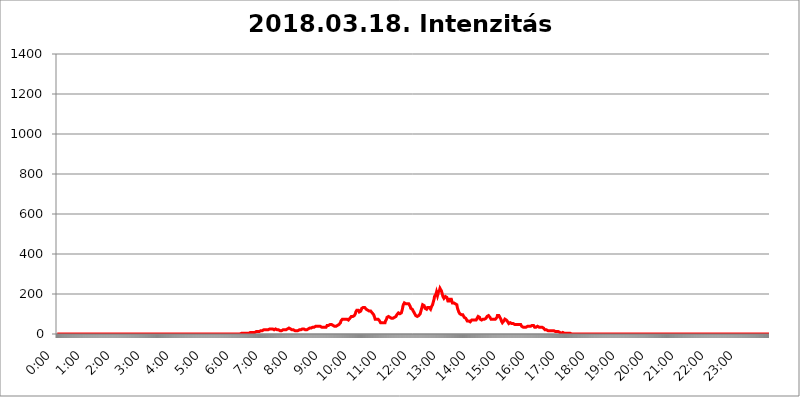
| Category | 2018.03.18. Intenzitás [W/m^2] |
|---|---|
| 0.0 | 0 |
| 0.0006944444444444445 | 0 |
| 0.001388888888888889 | 0 |
| 0.0020833333333333333 | 0 |
| 0.002777777777777778 | 0 |
| 0.003472222222222222 | 0 |
| 0.004166666666666667 | 0 |
| 0.004861111111111111 | 0 |
| 0.005555555555555556 | 0 |
| 0.0062499999999999995 | 0 |
| 0.006944444444444444 | 0 |
| 0.007638888888888889 | 0 |
| 0.008333333333333333 | 0 |
| 0.009027777777777779 | 0 |
| 0.009722222222222222 | 0 |
| 0.010416666666666666 | 0 |
| 0.011111111111111112 | 0 |
| 0.011805555555555555 | 0 |
| 0.012499999999999999 | 0 |
| 0.013194444444444444 | 0 |
| 0.013888888888888888 | 0 |
| 0.014583333333333332 | 0 |
| 0.015277777777777777 | 0 |
| 0.015972222222222224 | 0 |
| 0.016666666666666666 | 0 |
| 0.017361111111111112 | 0 |
| 0.018055555555555557 | 0 |
| 0.01875 | 0 |
| 0.019444444444444445 | 0 |
| 0.02013888888888889 | 0 |
| 0.020833333333333332 | 0 |
| 0.02152777777777778 | 0 |
| 0.022222222222222223 | 0 |
| 0.02291666666666667 | 0 |
| 0.02361111111111111 | 0 |
| 0.024305555555555556 | 0 |
| 0.024999999999999998 | 0 |
| 0.025694444444444447 | 0 |
| 0.02638888888888889 | 0 |
| 0.027083333333333334 | 0 |
| 0.027777777777777776 | 0 |
| 0.02847222222222222 | 0 |
| 0.029166666666666664 | 0 |
| 0.029861111111111113 | 0 |
| 0.030555555555555555 | 0 |
| 0.03125 | 0 |
| 0.03194444444444445 | 0 |
| 0.03263888888888889 | 0 |
| 0.03333333333333333 | 0 |
| 0.034027777777777775 | 0 |
| 0.034722222222222224 | 0 |
| 0.035416666666666666 | 0 |
| 0.036111111111111115 | 0 |
| 0.03680555555555556 | 0 |
| 0.0375 | 0 |
| 0.03819444444444444 | 0 |
| 0.03888888888888889 | 0 |
| 0.03958333333333333 | 0 |
| 0.04027777777777778 | 0 |
| 0.04097222222222222 | 0 |
| 0.041666666666666664 | 0 |
| 0.042361111111111106 | 0 |
| 0.04305555555555556 | 0 |
| 0.043750000000000004 | 0 |
| 0.044444444444444446 | 0 |
| 0.04513888888888889 | 0 |
| 0.04583333333333334 | 0 |
| 0.04652777777777778 | 0 |
| 0.04722222222222222 | 0 |
| 0.04791666666666666 | 0 |
| 0.04861111111111111 | 0 |
| 0.049305555555555554 | 0 |
| 0.049999999999999996 | 0 |
| 0.05069444444444445 | 0 |
| 0.051388888888888894 | 0 |
| 0.052083333333333336 | 0 |
| 0.05277777777777778 | 0 |
| 0.05347222222222222 | 0 |
| 0.05416666666666667 | 0 |
| 0.05486111111111111 | 0 |
| 0.05555555555555555 | 0 |
| 0.05625 | 0 |
| 0.05694444444444444 | 0 |
| 0.057638888888888885 | 0 |
| 0.05833333333333333 | 0 |
| 0.05902777777777778 | 0 |
| 0.059722222222222225 | 0 |
| 0.06041666666666667 | 0 |
| 0.061111111111111116 | 0 |
| 0.06180555555555556 | 0 |
| 0.0625 | 0 |
| 0.06319444444444444 | 0 |
| 0.06388888888888888 | 0 |
| 0.06458333333333334 | 0 |
| 0.06527777777777778 | 0 |
| 0.06597222222222222 | 0 |
| 0.06666666666666667 | 0 |
| 0.06736111111111111 | 0 |
| 0.06805555555555555 | 0 |
| 0.06874999999999999 | 0 |
| 0.06944444444444443 | 0 |
| 0.07013888888888889 | 0 |
| 0.07083333333333333 | 0 |
| 0.07152777777777779 | 0 |
| 0.07222222222222223 | 0 |
| 0.07291666666666667 | 0 |
| 0.07361111111111111 | 0 |
| 0.07430555555555556 | 0 |
| 0.075 | 0 |
| 0.07569444444444444 | 0 |
| 0.0763888888888889 | 0 |
| 0.07708333333333334 | 0 |
| 0.07777777777777778 | 0 |
| 0.07847222222222222 | 0 |
| 0.07916666666666666 | 0 |
| 0.0798611111111111 | 0 |
| 0.08055555555555556 | 0 |
| 0.08125 | 0 |
| 0.08194444444444444 | 0 |
| 0.08263888888888889 | 0 |
| 0.08333333333333333 | 0 |
| 0.08402777777777777 | 0 |
| 0.08472222222222221 | 0 |
| 0.08541666666666665 | 0 |
| 0.08611111111111112 | 0 |
| 0.08680555555555557 | 0 |
| 0.08750000000000001 | 0 |
| 0.08819444444444445 | 0 |
| 0.08888888888888889 | 0 |
| 0.08958333333333333 | 0 |
| 0.09027777777777778 | 0 |
| 0.09097222222222222 | 0 |
| 0.09166666666666667 | 0 |
| 0.09236111111111112 | 0 |
| 0.09305555555555556 | 0 |
| 0.09375 | 0 |
| 0.09444444444444444 | 0 |
| 0.09513888888888888 | 0 |
| 0.09583333333333333 | 0 |
| 0.09652777777777777 | 0 |
| 0.09722222222222222 | 0 |
| 0.09791666666666667 | 0 |
| 0.09861111111111111 | 0 |
| 0.09930555555555555 | 0 |
| 0.09999999999999999 | 0 |
| 0.10069444444444443 | 0 |
| 0.1013888888888889 | 0 |
| 0.10208333333333335 | 0 |
| 0.10277777777777779 | 0 |
| 0.10347222222222223 | 0 |
| 0.10416666666666667 | 0 |
| 0.10486111111111111 | 0 |
| 0.10555555555555556 | 0 |
| 0.10625 | 0 |
| 0.10694444444444444 | 0 |
| 0.1076388888888889 | 0 |
| 0.10833333333333334 | 0 |
| 0.10902777777777778 | 0 |
| 0.10972222222222222 | 0 |
| 0.1111111111111111 | 0 |
| 0.11180555555555556 | 0 |
| 0.11180555555555556 | 0 |
| 0.1125 | 0 |
| 0.11319444444444444 | 0 |
| 0.11388888888888889 | 0 |
| 0.11458333333333333 | 0 |
| 0.11527777777777777 | 0 |
| 0.11597222222222221 | 0 |
| 0.11666666666666665 | 0 |
| 0.1173611111111111 | 0 |
| 0.11805555555555557 | 0 |
| 0.11944444444444445 | 0 |
| 0.12013888888888889 | 0 |
| 0.12083333333333333 | 0 |
| 0.12152777777777778 | 0 |
| 0.12222222222222223 | 0 |
| 0.12291666666666667 | 0 |
| 0.12291666666666667 | 0 |
| 0.12361111111111112 | 0 |
| 0.12430555555555556 | 0 |
| 0.125 | 0 |
| 0.12569444444444444 | 0 |
| 0.12638888888888888 | 0 |
| 0.12708333333333333 | 0 |
| 0.16875 | 0 |
| 0.12847222222222224 | 0 |
| 0.12916666666666668 | 0 |
| 0.12986111111111112 | 0 |
| 0.13055555555555556 | 0 |
| 0.13125 | 0 |
| 0.13194444444444445 | 0 |
| 0.1326388888888889 | 0 |
| 0.13333333333333333 | 0 |
| 0.13402777777777777 | 0 |
| 0.13402777777777777 | 0 |
| 0.13472222222222222 | 0 |
| 0.13541666666666666 | 0 |
| 0.1361111111111111 | 0 |
| 0.13749999999999998 | 0 |
| 0.13819444444444443 | 0 |
| 0.1388888888888889 | 0 |
| 0.13958333333333334 | 0 |
| 0.14027777777777778 | 0 |
| 0.14097222222222222 | 0 |
| 0.14166666666666666 | 0 |
| 0.1423611111111111 | 0 |
| 0.14305555555555557 | 0 |
| 0.14375000000000002 | 0 |
| 0.14444444444444446 | 0 |
| 0.1451388888888889 | 0 |
| 0.1451388888888889 | 0 |
| 0.14652777777777778 | 0 |
| 0.14722222222222223 | 0 |
| 0.14791666666666667 | 0 |
| 0.1486111111111111 | 0 |
| 0.14930555555555555 | 0 |
| 0.15 | 0 |
| 0.15069444444444444 | 0 |
| 0.15138888888888888 | 0 |
| 0.15208333333333332 | 0 |
| 0.15277777777777776 | 0 |
| 0.15347222222222223 | 0 |
| 0.15416666666666667 | 0 |
| 0.15486111111111112 | 0 |
| 0.15555555555555556 | 0 |
| 0.15625 | 0 |
| 0.15694444444444444 | 0 |
| 0.15763888888888888 | 0 |
| 0.15833333333333333 | 0 |
| 0.15902777777777777 | 0 |
| 0.15972222222222224 | 0 |
| 0.16041666666666668 | 0 |
| 0.16111111111111112 | 0 |
| 0.16180555555555556 | 0 |
| 0.1625 | 0 |
| 0.16319444444444445 | 0 |
| 0.1638888888888889 | 0 |
| 0.16458333333333333 | 0 |
| 0.16527777777777777 | 0 |
| 0.16597222222222222 | 0 |
| 0.16666666666666666 | 0 |
| 0.1673611111111111 | 0 |
| 0.16805555555555554 | 0 |
| 0.16874999999999998 | 0 |
| 0.16944444444444443 | 0 |
| 0.17013888888888887 | 0 |
| 0.1708333333333333 | 0 |
| 0.17152777777777775 | 0 |
| 0.17222222222222225 | 0 |
| 0.1729166666666667 | 0 |
| 0.17361111111111113 | 0 |
| 0.17430555555555557 | 0 |
| 0.17500000000000002 | 0 |
| 0.17569444444444446 | 0 |
| 0.1763888888888889 | 0 |
| 0.17708333333333334 | 0 |
| 0.17777777777777778 | 0 |
| 0.17847222222222223 | 0 |
| 0.17916666666666667 | 0 |
| 0.1798611111111111 | 0 |
| 0.18055555555555555 | 0 |
| 0.18125 | 0 |
| 0.18194444444444444 | 0 |
| 0.1826388888888889 | 0 |
| 0.18333333333333335 | 0 |
| 0.1840277777777778 | 0 |
| 0.18472222222222223 | 0 |
| 0.18541666666666667 | 0 |
| 0.18611111111111112 | 0 |
| 0.18680555555555556 | 0 |
| 0.1875 | 0 |
| 0.18819444444444444 | 0 |
| 0.18888888888888888 | 0 |
| 0.18958333333333333 | 0 |
| 0.19027777777777777 | 0 |
| 0.1909722222222222 | 0 |
| 0.19166666666666665 | 0 |
| 0.19236111111111112 | 0 |
| 0.19305555555555554 | 0 |
| 0.19375 | 0 |
| 0.19444444444444445 | 0 |
| 0.1951388888888889 | 0 |
| 0.19583333333333333 | 0 |
| 0.19652777777777777 | 0 |
| 0.19722222222222222 | 0 |
| 0.19791666666666666 | 0 |
| 0.1986111111111111 | 0 |
| 0.19930555555555554 | 0 |
| 0.19999999999999998 | 0 |
| 0.20069444444444443 | 0 |
| 0.20138888888888887 | 0 |
| 0.2020833333333333 | 0 |
| 0.2027777777777778 | 0 |
| 0.2034722222222222 | 0 |
| 0.2041666666666667 | 0 |
| 0.20486111111111113 | 0 |
| 0.20555555555555557 | 0 |
| 0.20625000000000002 | 0 |
| 0.20694444444444446 | 0 |
| 0.2076388888888889 | 0 |
| 0.20833333333333334 | 0 |
| 0.20902777777777778 | 0 |
| 0.20972222222222223 | 0 |
| 0.21041666666666667 | 0 |
| 0.2111111111111111 | 0 |
| 0.21180555555555555 | 0 |
| 0.2125 | 0 |
| 0.21319444444444444 | 0 |
| 0.2138888888888889 | 0 |
| 0.21458333333333335 | 0 |
| 0.2152777777777778 | 0 |
| 0.21597222222222223 | 0 |
| 0.21666666666666667 | 0 |
| 0.21736111111111112 | 0 |
| 0.21805555555555556 | 0 |
| 0.21875 | 0 |
| 0.21944444444444444 | 0 |
| 0.22013888888888888 | 0 |
| 0.22083333333333333 | 0 |
| 0.22152777777777777 | 0 |
| 0.2222222222222222 | 0 |
| 0.22291666666666665 | 0 |
| 0.2236111111111111 | 0 |
| 0.22430555555555556 | 0 |
| 0.225 | 0 |
| 0.22569444444444445 | 0 |
| 0.2263888888888889 | 0 |
| 0.22708333333333333 | 0 |
| 0.22777777777777777 | 0 |
| 0.22847222222222222 | 0 |
| 0.22916666666666666 | 0 |
| 0.2298611111111111 | 0 |
| 0.23055555555555554 | 0 |
| 0.23124999999999998 | 0 |
| 0.23194444444444443 | 0 |
| 0.23263888888888887 | 0 |
| 0.2333333333333333 | 0 |
| 0.2340277777777778 | 0 |
| 0.2347222222222222 | 0 |
| 0.2354166666666667 | 0 |
| 0.23611111111111113 | 0 |
| 0.23680555555555557 | 0 |
| 0.23750000000000002 | 0 |
| 0.23819444444444446 | 0 |
| 0.2388888888888889 | 0 |
| 0.23958333333333334 | 0 |
| 0.24027777777777778 | 0 |
| 0.24097222222222223 | 0 |
| 0.24166666666666667 | 0 |
| 0.2423611111111111 | 0 |
| 0.24305555555555555 | 0 |
| 0.24375 | 0 |
| 0.24444444444444446 | 0 |
| 0.24513888888888888 | 0 |
| 0.24583333333333335 | 0 |
| 0.2465277777777778 | 0 |
| 0.24722222222222223 | 0 |
| 0.24791666666666667 | 0 |
| 0.24861111111111112 | 0 |
| 0.24930555555555556 | 0 |
| 0.25 | 0 |
| 0.25069444444444444 | 0 |
| 0.2513888888888889 | 0 |
| 0.2520833333333333 | 0 |
| 0.25277777777777777 | 0 |
| 0.2534722222222222 | 0 |
| 0.25416666666666665 | 0 |
| 0.2548611111111111 | 0 |
| 0.2555555555555556 | 0 |
| 0.25625000000000003 | 0 |
| 0.2569444444444445 | 0 |
| 0.2576388888888889 | 0 |
| 0.25833333333333336 | 3.525 |
| 0.2590277777777778 | 3.525 |
| 0.25972222222222224 | 3.525 |
| 0.2604166666666667 | 3.525 |
| 0.2611111111111111 | 3.525 |
| 0.26180555555555557 | 3.525 |
| 0.2625 | 3.525 |
| 0.26319444444444445 | 3.525 |
| 0.2638888888888889 | 3.525 |
| 0.26458333333333334 | 3.525 |
| 0.2652777777777778 | 3.525 |
| 0.2659722222222222 | 3.525 |
| 0.26666666666666666 | 3.525 |
| 0.2673611111111111 | 3.525 |
| 0.26805555555555555 | 3.525 |
| 0.26875 | 3.525 |
| 0.26944444444444443 | 3.525 |
| 0.2701388888888889 | 7.887 |
| 0.2708333333333333 | 7.887 |
| 0.27152777777777776 | 7.887 |
| 0.2722222222222222 | 7.887 |
| 0.27291666666666664 | 7.887 |
| 0.2736111111111111 | 7.887 |
| 0.2743055555555555 | 7.887 |
| 0.27499999999999997 | 7.887 |
| 0.27569444444444446 | 7.887 |
| 0.27638888888888885 | 7.887 |
| 0.27708333333333335 | 7.887 |
| 0.2777777777777778 | 7.887 |
| 0.27847222222222223 | 12.257 |
| 0.2791666666666667 | 12.257 |
| 0.2798611111111111 | 12.257 |
| 0.28055555555555556 | 12.257 |
| 0.28125 | 12.257 |
| 0.28194444444444444 | 12.257 |
| 0.2826388888888889 | 12.257 |
| 0.2833333333333333 | 12.257 |
| 0.28402777777777777 | 12.257 |
| 0.2847222222222222 | 12.257 |
| 0.28541666666666665 | 16.636 |
| 0.28611111111111115 | 16.636 |
| 0.28680555555555554 | 16.636 |
| 0.28750000000000003 | 16.636 |
| 0.2881944444444445 | 16.636 |
| 0.2888888888888889 | 21.024 |
| 0.28958333333333336 | 21.024 |
| 0.2902777777777778 | 16.636 |
| 0.29097222222222224 | 16.636 |
| 0.2916666666666667 | 21.024 |
| 0.2923611111111111 | 21.024 |
| 0.29305555555555557 | 21.024 |
| 0.29375 | 21.024 |
| 0.29444444444444445 | 21.024 |
| 0.2951388888888889 | 21.024 |
| 0.29583333333333334 | 21.024 |
| 0.2965277777777778 | 25.419 |
| 0.2972222222222222 | 25.419 |
| 0.29791666666666666 | 25.419 |
| 0.2986111111111111 | 25.419 |
| 0.29930555555555555 | 25.419 |
| 0.3 | 25.419 |
| 0.30069444444444443 | 21.024 |
| 0.3013888888888889 | 21.024 |
| 0.3020833333333333 | 25.419 |
| 0.30277777777777776 | 21.024 |
| 0.3034722222222222 | 21.024 |
| 0.30416666666666664 | 21.024 |
| 0.3048611111111111 | 21.024 |
| 0.3055555555555555 | 25.419 |
| 0.30624999999999997 | 25.419 |
| 0.3069444444444444 | 25.419 |
| 0.3076388888888889 | 21.024 |
| 0.30833333333333335 | 21.024 |
| 0.3090277777777778 | 21.024 |
| 0.30972222222222223 | 21.024 |
| 0.3104166666666667 | 21.024 |
| 0.3111111111111111 | 21.024 |
| 0.31180555555555556 | 16.636 |
| 0.3125 | 16.636 |
| 0.31319444444444444 | 16.636 |
| 0.3138888888888889 | 16.636 |
| 0.3145833333333333 | 16.636 |
| 0.31527777777777777 | 16.636 |
| 0.3159722222222222 | 21.024 |
| 0.31666666666666665 | 21.024 |
| 0.31736111111111115 | 21.024 |
| 0.31805555555555554 | 21.024 |
| 0.31875000000000003 | 21.024 |
| 0.3194444444444445 | 21.024 |
| 0.3201388888888889 | 21.024 |
| 0.32083333333333336 | 21.024 |
| 0.3215277777777778 | 21.024 |
| 0.32222222222222224 | 25.419 |
| 0.3229166666666667 | 25.419 |
| 0.3236111111111111 | 29.823 |
| 0.32430555555555557 | 29.823 |
| 0.325 | 29.823 |
| 0.32569444444444445 | 29.823 |
| 0.3263888888888889 | 29.823 |
| 0.32708333333333334 | 25.419 |
| 0.3277777777777778 | 21.024 |
| 0.3284722222222222 | 21.024 |
| 0.32916666666666666 | 21.024 |
| 0.3298611111111111 | 25.419 |
| 0.33055555555555555 | 25.419 |
| 0.33125 | 21.024 |
| 0.33194444444444443 | 21.024 |
| 0.3326388888888889 | 16.636 |
| 0.3333333333333333 | 16.636 |
| 0.3340277777777778 | 21.024 |
| 0.3347222222222222 | 21.024 |
| 0.3354166666666667 | 16.636 |
| 0.3361111111111111 | 16.636 |
| 0.3368055555555556 | 16.636 |
| 0.33749999999999997 | 16.636 |
| 0.33819444444444446 | 21.024 |
| 0.33888888888888885 | 21.024 |
| 0.33958333333333335 | 21.024 |
| 0.34027777777777773 | 21.024 |
| 0.34097222222222223 | 21.024 |
| 0.3416666666666666 | 21.024 |
| 0.3423611111111111 | 25.419 |
| 0.3430555555555555 | 25.419 |
| 0.34375 | 25.419 |
| 0.3444444444444445 | 25.419 |
| 0.3451388888888889 | 25.419 |
| 0.3458333333333334 | 25.419 |
| 0.34652777777777777 | 25.419 |
| 0.34722222222222227 | 21.024 |
| 0.34791666666666665 | 21.024 |
| 0.34861111111111115 | 21.024 |
| 0.34930555555555554 | 21.024 |
| 0.35000000000000003 | 21.024 |
| 0.3506944444444444 | 21.024 |
| 0.3513888888888889 | 25.419 |
| 0.3520833333333333 | 25.419 |
| 0.3527777777777778 | 25.419 |
| 0.3534722222222222 | 25.419 |
| 0.3541666666666667 | 29.823 |
| 0.3548611111111111 | 29.823 |
| 0.35555555555555557 | 29.823 |
| 0.35625 | 29.823 |
| 0.35694444444444445 | 29.823 |
| 0.3576388888888889 | 34.234 |
| 0.35833333333333334 | 34.234 |
| 0.3590277777777778 | 34.234 |
| 0.3597222222222222 | 34.234 |
| 0.36041666666666666 | 34.234 |
| 0.3611111111111111 | 34.234 |
| 0.36180555555555555 | 34.234 |
| 0.3625 | 38.653 |
| 0.36319444444444443 | 38.653 |
| 0.3638888888888889 | 34.234 |
| 0.3645833333333333 | 38.653 |
| 0.3652777777777778 | 38.653 |
| 0.3659722222222222 | 38.653 |
| 0.3666666666666667 | 38.653 |
| 0.3673611111111111 | 38.653 |
| 0.3680555555555556 | 38.653 |
| 0.36874999999999997 | 38.653 |
| 0.36944444444444446 | 34.234 |
| 0.37013888888888885 | 34.234 |
| 0.37083333333333335 | 34.234 |
| 0.37152777777777773 | 34.234 |
| 0.37222222222222223 | 34.234 |
| 0.3729166666666666 | 34.234 |
| 0.3736111111111111 | 38.653 |
| 0.3743055555555555 | 34.234 |
| 0.375 | 34.234 |
| 0.3756944444444445 | 34.234 |
| 0.3763888888888889 | 34.234 |
| 0.3770833333333334 | 34.234 |
| 0.37777777777777777 | 38.653 |
| 0.37847222222222227 | 43.079 |
| 0.37916666666666665 | 43.079 |
| 0.37986111111111115 | 43.079 |
| 0.38055555555555554 | 43.079 |
| 0.38125000000000003 | 43.079 |
| 0.3819444444444444 | 47.511 |
| 0.3826388888888889 | 47.511 |
| 0.3833333333333333 | 47.511 |
| 0.3840277777777778 | 47.511 |
| 0.3847222222222222 | 47.511 |
| 0.3854166666666667 | 43.079 |
| 0.3861111111111111 | 43.079 |
| 0.38680555555555557 | 43.079 |
| 0.3875 | 38.653 |
| 0.38819444444444445 | 38.653 |
| 0.3888888888888889 | 38.653 |
| 0.38958333333333334 | 38.653 |
| 0.3902777777777778 | 38.653 |
| 0.3909722222222222 | 38.653 |
| 0.39166666666666666 | 38.653 |
| 0.3923611111111111 | 43.079 |
| 0.39305555555555555 | 43.079 |
| 0.39375 | 47.511 |
| 0.39444444444444443 | 47.511 |
| 0.3951388888888889 | 47.511 |
| 0.3958333333333333 | 51.951 |
| 0.3965277777777778 | 51.951 |
| 0.3972222222222222 | 56.398 |
| 0.3979166666666667 | 65.31 |
| 0.3986111111111111 | 65.31 |
| 0.3993055555555556 | 69.775 |
| 0.39999999999999997 | 74.246 |
| 0.40069444444444446 | 74.246 |
| 0.40138888888888885 | 74.246 |
| 0.40208333333333335 | 74.246 |
| 0.40277777777777773 | 74.246 |
| 0.40347222222222223 | 74.246 |
| 0.4041666666666666 | 74.246 |
| 0.4048611111111111 | 74.246 |
| 0.4055555555555555 | 74.246 |
| 0.40625 | 74.246 |
| 0.4069444444444445 | 74.246 |
| 0.4076388888888889 | 69.775 |
| 0.4083333333333334 | 69.775 |
| 0.40902777777777777 | 74.246 |
| 0.40972222222222227 | 74.246 |
| 0.41041666666666665 | 78.722 |
| 0.41111111111111115 | 83.205 |
| 0.41180555555555554 | 83.205 |
| 0.41250000000000003 | 87.692 |
| 0.4131944444444444 | 87.692 |
| 0.4138888888888889 | 87.692 |
| 0.4145833333333333 | 87.692 |
| 0.4152777777777778 | 87.692 |
| 0.4159722222222222 | 92.184 |
| 0.4166666666666667 | 92.184 |
| 0.4173611111111111 | 96.682 |
| 0.41805555555555557 | 101.184 |
| 0.41875 | 110.201 |
| 0.41944444444444445 | 114.716 |
| 0.4201388888888889 | 119.235 |
| 0.42083333333333334 | 119.235 |
| 0.4215277777777778 | 119.235 |
| 0.4222222222222222 | 119.235 |
| 0.42291666666666666 | 114.716 |
| 0.4236111111111111 | 110.201 |
| 0.42430555555555555 | 105.69 |
| 0.425 | 110.201 |
| 0.42569444444444443 | 114.716 |
| 0.4263888888888889 | 119.235 |
| 0.4270833333333333 | 128.284 |
| 0.4277777777777778 | 132.814 |
| 0.4284722222222222 | 132.814 |
| 0.4291666666666667 | 132.814 |
| 0.4298611111111111 | 137.347 |
| 0.4305555555555556 | 137.347 |
| 0.43124999999999997 | 132.814 |
| 0.43194444444444446 | 128.284 |
| 0.43263888888888885 | 128.284 |
| 0.43333333333333335 | 123.758 |
| 0.43402777777777773 | 123.758 |
| 0.43472222222222223 | 123.758 |
| 0.4354166666666666 | 119.235 |
| 0.4361111111111111 | 119.235 |
| 0.4368055555555555 | 114.716 |
| 0.4375 | 114.716 |
| 0.4381944444444445 | 110.201 |
| 0.4388888888888889 | 110.201 |
| 0.4395833333333334 | 114.716 |
| 0.44027777777777777 | 114.716 |
| 0.44097222222222227 | 110.201 |
| 0.44166666666666665 | 105.69 |
| 0.44236111111111115 | 105.69 |
| 0.44305555555555554 | 105.69 |
| 0.44375000000000003 | 96.682 |
| 0.4444444444444444 | 92.184 |
| 0.4451388888888889 | 83.205 |
| 0.4458333333333333 | 74.246 |
| 0.4465277777777778 | 78.722 |
| 0.4472222222222222 | 74.246 |
| 0.4479166666666667 | 74.246 |
| 0.4486111111111111 | 74.246 |
| 0.44930555555555557 | 74.246 |
| 0.45 | 74.246 |
| 0.45069444444444445 | 74.246 |
| 0.4513888888888889 | 69.775 |
| 0.45208333333333334 | 65.31 |
| 0.4527777777777778 | 60.85 |
| 0.4534722222222222 | 56.398 |
| 0.45416666666666666 | 56.398 |
| 0.4548611111111111 | 56.398 |
| 0.45555555555555555 | 56.398 |
| 0.45625 | 60.85 |
| 0.45694444444444443 | 60.85 |
| 0.4576388888888889 | 56.398 |
| 0.4583333333333333 | 56.398 |
| 0.4590277777777778 | 56.398 |
| 0.4597222222222222 | 56.398 |
| 0.4604166666666667 | 65.31 |
| 0.4611111111111111 | 69.775 |
| 0.4618055555555556 | 74.246 |
| 0.46249999999999997 | 83.205 |
| 0.46319444444444446 | 87.692 |
| 0.46388888888888885 | 87.692 |
| 0.46458333333333335 | 87.692 |
| 0.46527777777777773 | 92.184 |
| 0.46597222222222223 | 87.692 |
| 0.4666666666666666 | 83.205 |
| 0.4673611111111111 | 78.722 |
| 0.4680555555555555 | 78.722 |
| 0.46875 | 78.722 |
| 0.4694444444444445 | 74.246 |
| 0.4701388888888889 | 78.722 |
| 0.4708333333333334 | 78.722 |
| 0.47152777777777777 | 78.722 |
| 0.47222222222222227 | 83.205 |
| 0.47291666666666665 | 83.205 |
| 0.47361111111111115 | 83.205 |
| 0.47430555555555554 | 87.692 |
| 0.47500000000000003 | 87.692 |
| 0.4756944444444444 | 92.184 |
| 0.4763888888888889 | 96.682 |
| 0.4770833333333333 | 101.184 |
| 0.4777777777777778 | 101.184 |
| 0.4784722222222222 | 105.69 |
| 0.4791666666666667 | 105.69 |
| 0.4798611111111111 | 105.69 |
| 0.48055555555555557 | 101.184 |
| 0.48125 | 101.184 |
| 0.48194444444444445 | 101.184 |
| 0.4826388888888889 | 105.69 |
| 0.48333333333333334 | 114.716 |
| 0.4840277777777778 | 123.758 |
| 0.4847222222222222 | 137.347 |
| 0.48541666666666666 | 146.423 |
| 0.4861111111111111 | 150.964 |
| 0.48680555555555555 | 155.509 |
| 0.4875 | 155.509 |
| 0.48819444444444443 | 150.964 |
| 0.4888888888888889 | 150.964 |
| 0.4895833333333333 | 146.423 |
| 0.4902777777777778 | 150.964 |
| 0.4909722222222222 | 150.964 |
| 0.4916666666666667 | 150.964 |
| 0.4923611111111111 | 155.509 |
| 0.4930555555555556 | 150.964 |
| 0.49374999999999997 | 150.964 |
| 0.49444444444444446 | 146.423 |
| 0.49513888888888885 | 137.347 |
| 0.49583333333333335 | 128.284 |
| 0.49652777777777773 | 123.758 |
| 0.49722222222222223 | 123.758 |
| 0.4979166666666666 | 123.758 |
| 0.4986111111111111 | 123.758 |
| 0.4993055555555555 | 119.235 |
| 0.5 | 110.201 |
| 0.5006944444444444 | 105.69 |
| 0.5013888888888889 | 101.184 |
| 0.5020833333333333 | 96.682 |
| 0.5027777777777778 | 92.184 |
| 0.5034722222222222 | 92.184 |
| 0.5041666666666667 | 87.692 |
| 0.5048611111111111 | 87.692 |
| 0.5055555555555555 | 87.692 |
| 0.50625 | 92.184 |
| 0.5069444444444444 | 92.184 |
| 0.5076388888888889 | 92.184 |
| 0.5083333333333333 | 96.682 |
| 0.5090277777777777 | 101.184 |
| 0.5097222222222222 | 110.201 |
| 0.5104166666666666 | 119.235 |
| 0.5111111111111112 | 128.284 |
| 0.5118055555555555 | 137.347 |
| 0.5125000000000001 | 146.423 |
| 0.5131944444444444 | 150.964 |
| 0.513888888888889 | 146.423 |
| 0.5145833333333333 | 141.884 |
| 0.5152777777777778 | 137.347 |
| 0.5159722222222222 | 128.284 |
| 0.5166666666666667 | 128.284 |
| 0.517361111111111 | 123.758 |
| 0.5180555555555556 | 123.758 |
| 0.5187499999999999 | 128.284 |
| 0.5194444444444445 | 132.814 |
| 0.5201388888888888 | 137.347 |
| 0.5208333333333334 | 137.347 |
| 0.5215277777777778 | 132.814 |
| 0.5222222222222223 | 128.284 |
| 0.5229166666666667 | 128.284 |
| 0.5236111111111111 | 123.758 |
| 0.5243055555555556 | 128.284 |
| 0.525 | 137.347 |
| 0.5256944444444445 | 141.884 |
| 0.5263888888888889 | 146.423 |
| 0.5270833333333333 | 155.509 |
| 0.5277777777777778 | 164.605 |
| 0.5284722222222222 | 173.709 |
| 0.5291666666666667 | 187.378 |
| 0.5298611111111111 | 191.937 |
| 0.5305555555555556 | 191.937 |
| 0.53125 | 201.058 |
| 0.5319444444444444 | 210.182 |
| 0.5326388888888889 | 201.058 |
| 0.5333333333333333 | 191.937 |
| 0.5340277777777778 | 196.497 |
| 0.5347222222222222 | 210.182 |
| 0.5354166666666667 | 214.746 |
| 0.5361111111111111 | 219.309 |
| 0.5368055555555555 | 228.436 |
| 0.5375 | 233 |
| 0.5381944444444444 | 228.436 |
| 0.5388888888888889 | 214.746 |
| 0.5395833333333333 | 210.182 |
| 0.5402777777777777 | 196.497 |
| 0.5409722222222222 | 187.378 |
| 0.5416666666666666 | 182.82 |
| 0.5423611111111112 | 178.264 |
| 0.5430555555555555 | 178.264 |
| 0.5437500000000001 | 182.82 |
| 0.5444444444444444 | 187.378 |
| 0.545138888888889 | 191.937 |
| 0.5458333333333333 | 187.378 |
| 0.5465277777777778 | 182.82 |
| 0.5472222222222222 | 182.82 |
| 0.5479166666666667 | 164.605 |
| 0.548611111111111 | 164.605 |
| 0.5493055555555556 | 164.605 |
| 0.5499999999999999 | 164.605 |
| 0.5506944444444445 | 173.709 |
| 0.5513888888888888 | 173.709 |
| 0.5520833333333334 | 173.709 |
| 0.5527777777777778 | 173.709 |
| 0.5534722222222223 | 164.605 |
| 0.5541666666666667 | 155.509 |
| 0.5548611111111111 | 150.964 |
| 0.5555555555555556 | 155.509 |
| 0.55625 | 155.509 |
| 0.5569444444444445 | 155.509 |
| 0.5576388888888889 | 155.509 |
| 0.5583333333333333 | 150.964 |
| 0.5590277777777778 | 155.509 |
| 0.5597222222222222 | 155.509 |
| 0.5604166666666667 | 146.423 |
| 0.5611111111111111 | 132.814 |
| 0.5618055555555556 | 123.758 |
| 0.5625 | 119.235 |
| 0.5631944444444444 | 110.201 |
| 0.5638888888888889 | 105.69 |
| 0.5645833333333333 | 101.184 |
| 0.5652777777777778 | 101.184 |
| 0.5659722222222222 | 96.682 |
| 0.5666666666666667 | 96.682 |
| 0.5673611111111111 | 101.184 |
| 0.5680555555555555 | 101.184 |
| 0.56875 | 96.682 |
| 0.5694444444444444 | 92.184 |
| 0.5701388888888889 | 92.184 |
| 0.5708333333333333 | 83.205 |
| 0.5715277777777777 | 83.205 |
| 0.5722222222222222 | 83.205 |
| 0.5729166666666666 | 78.722 |
| 0.5736111111111112 | 74.246 |
| 0.5743055555555555 | 74.246 |
| 0.5750000000000001 | 65.31 |
| 0.5756944444444444 | 65.31 |
| 0.576388888888889 | 65.31 |
| 0.5770833333333333 | 65.31 |
| 0.5777777777777778 | 60.85 |
| 0.5784722222222222 | 60.85 |
| 0.5791666666666667 | 60.85 |
| 0.579861111111111 | 65.31 |
| 0.5805555555555556 | 65.31 |
| 0.5812499999999999 | 69.775 |
| 0.5819444444444445 | 69.775 |
| 0.5826388888888888 | 69.775 |
| 0.5833333333333334 | 69.775 |
| 0.5840277777777778 | 69.775 |
| 0.5847222222222223 | 69.775 |
| 0.5854166666666667 | 69.775 |
| 0.5861111111111111 | 69.775 |
| 0.5868055555555556 | 69.775 |
| 0.5875 | 69.775 |
| 0.5881944444444445 | 74.246 |
| 0.5888888888888889 | 78.722 |
| 0.5895833333333333 | 83.205 |
| 0.5902777777777778 | 87.692 |
| 0.5909722222222222 | 87.692 |
| 0.5916666666666667 | 87.692 |
| 0.5923611111111111 | 83.205 |
| 0.5930555555555556 | 74.246 |
| 0.59375 | 69.775 |
| 0.5944444444444444 | 69.775 |
| 0.5951388888888889 | 69.775 |
| 0.5958333333333333 | 74.246 |
| 0.5965277777777778 | 74.246 |
| 0.5972222222222222 | 74.246 |
| 0.5979166666666667 | 74.246 |
| 0.5986111111111111 | 74.246 |
| 0.5993055555555555 | 74.246 |
| 0.6 | 74.246 |
| 0.6006944444444444 | 78.722 |
| 0.6013888888888889 | 78.722 |
| 0.6020833333333333 | 83.205 |
| 0.6027777777777777 | 87.692 |
| 0.6034722222222222 | 92.184 |
| 0.6041666666666666 | 92.184 |
| 0.6048611111111112 | 92.184 |
| 0.6055555555555555 | 92.184 |
| 0.6062500000000001 | 87.692 |
| 0.6069444444444444 | 83.205 |
| 0.607638888888889 | 78.722 |
| 0.6083333333333333 | 74.246 |
| 0.6090277777777778 | 69.775 |
| 0.6097222222222222 | 69.775 |
| 0.6104166666666667 | 74.246 |
| 0.611111111111111 | 74.246 |
| 0.6118055555555556 | 74.246 |
| 0.6124999999999999 | 74.246 |
| 0.6131944444444445 | 74.246 |
| 0.6138888888888888 | 74.246 |
| 0.6145833333333334 | 74.246 |
| 0.6152777777777778 | 78.722 |
| 0.6159722222222223 | 78.722 |
| 0.6166666666666667 | 83.205 |
| 0.6173611111111111 | 92.184 |
| 0.6180555555555556 | 96.682 |
| 0.61875 | 96.682 |
| 0.6194444444444445 | 92.184 |
| 0.6201388888888889 | 87.692 |
| 0.6208333333333333 | 83.205 |
| 0.6215277777777778 | 78.722 |
| 0.6222222222222222 | 74.246 |
| 0.6229166666666667 | 65.31 |
| 0.6236111111111111 | 60.85 |
| 0.6243055555555556 | 56.398 |
| 0.625 | 56.398 |
| 0.6256944444444444 | 60.85 |
| 0.6263888888888889 | 65.31 |
| 0.6270833333333333 | 65.31 |
| 0.6277777777777778 | 74.246 |
| 0.6284722222222222 | 74.246 |
| 0.6291666666666667 | 74.246 |
| 0.6298611111111111 | 69.775 |
| 0.6305555555555555 | 65.31 |
| 0.63125 | 65.31 |
| 0.6319444444444444 | 60.85 |
| 0.6326388888888889 | 56.398 |
| 0.6333333333333333 | 51.951 |
| 0.6340277777777777 | 51.951 |
| 0.6347222222222222 | 56.398 |
| 0.6354166666666666 | 56.398 |
| 0.6361111111111112 | 51.951 |
| 0.6368055555555555 | 51.951 |
| 0.6375000000000001 | 51.951 |
| 0.6381944444444444 | 51.951 |
| 0.638888888888889 | 56.398 |
| 0.6395833333333333 | 51.951 |
| 0.6402777777777778 | 51.951 |
| 0.6409722222222222 | 47.511 |
| 0.6416666666666667 | 47.511 |
| 0.642361111111111 | 47.511 |
| 0.6430555555555556 | 47.511 |
| 0.6437499999999999 | 47.511 |
| 0.6444444444444445 | 47.511 |
| 0.6451388888888888 | 51.951 |
| 0.6458333333333334 | 47.511 |
| 0.6465277777777778 | 47.511 |
| 0.6472222222222223 | 51.951 |
| 0.6479166666666667 | 47.511 |
| 0.6486111111111111 | 47.511 |
| 0.6493055555555556 | 47.511 |
| 0.65 | 47.511 |
| 0.6506944444444445 | 43.079 |
| 0.6513888888888889 | 38.653 |
| 0.6520833333333333 | 38.653 |
| 0.6527777777777778 | 34.234 |
| 0.6534722222222222 | 34.234 |
| 0.6541666666666667 | 29.823 |
| 0.6548611111111111 | 29.823 |
| 0.6555555555555556 | 34.234 |
| 0.65625 | 34.234 |
| 0.6569444444444444 | 34.234 |
| 0.6576388888888889 | 34.234 |
| 0.6583333333333333 | 38.653 |
| 0.6590277777777778 | 38.653 |
| 0.6597222222222222 | 38.653 |
| 0.6604166666666667 | 38.653 |
| 0.6611111111111111 | 38.653 |
| 0.6618055555555555 | 38.653 |
| 0.6625 | 38.653 |
| 0.6631944444444444 | 38.653 |
| 0.6638888888888889 | 38.653 |
| 0.6645833333333333 | 38.653 |
| 0.6652777777777777 | 38.653 |
| 0.6659722222222222 | 43.079 |
| 0.6666666666666666 | 43.079 |
| 0.6673611111111111 | 43.079 |
| 0.6680555555555556 | 43.079 |
| 0.6687500000000001 | 38.653 |
| 0.6694444444444444 | 34.234 |
| 0.6701388888888888 | 34.234 |
| 0.6708333333333334 | 34.234 |
| 0.6715277777777778 | 34.234 |
| 0.6722222222222222 | 34.234 |
| 0.6729166666666666 | 34.234 |
| 0.6736111111111112 | 38.653 |
| 0.6743055555555556 | 34.234 |
| 0.6749999999999999 | 34.234 |
| 0.6756944444444444 | 34.234 |
| 0.6763888888888889 | 29.823 |
| 0.6770833333333334 | 34.234 |
| 0.6777777777777777 | 34.234 |
| 0.6784722222222223 | 34.234 |
| 0.6791666666666667 | 34.234 |
| 0.6798611111111111 | 34.234 |
| 0.6805555555555555 | 34.234 |
| 0.68125 | 29.823 |
| 0.6819444444444445 | 29.823 |
| 0.6826388888888889 | 29.823 |
| 0.6833333333333332 | 25.419 |
| 0.6840277777777778 | 21.024 |
| 0.6847222222222222 | 21.024 |
| 0.6854166666666667 | 21.024 |
| 0.686111111111111 | 21.024 |
| 0.6868055555555556 | 21.024 |
| 0.6875 | 16.636 |
| 0.6881944444444444 | 16.636 |
| 0.688888888888889 | 16.636 |
| 0.6895833333333333 | 16.636 |
| 0.6902777777777778 | 16.636 |
| 0.6909722222222222 | 16.636 |
| 0.6916666666666668 | 16.636 |
| 0.6923611111111111 | 16.636 |
| 0.6930555555555555 | 16.636 |
| 0.69375 | 16.636 |
| 0.6944444444444445 | 16.636 |
| 0.6951388888888889 | 16.636 |
| 0.6958333333333333 | 16.636 |
| 0.6965277777777777 | 16.636 |
| 0.6972222222222223 | 16.636 |
| 0.6979166666666666 | 16.636 |
| 0.6986111111111111 | 12.257 |
| 0.6993055555555556 | 12.257 |
| 0.7000000000000001 | 12.257 |
| 0.7006944444444444 | 12.257 |
| 0.7013888888888888 | 12.257 |
| 0.7020833333333334 | 12.257 |
| 0.7027777777777778 | 12.257 |
| 0.7034722222222222 | 12.257 |
| 0.7041666666666666 | 7.887 |
| 0.7048611111111112 | 7.887 |
| 0.7055555555555556 | 7.887 |
| 0.7062499999999999 | 7.887 |
| 0.7069444444444444 | 3.525 |
| 0.7076388888888889 | 7.887 |
| 0.7083333333333334 | 7.887 |
| 0.7090277777777777 | 7.887 |
| 0.7097222222222223 | 7.887 |
| 0.7104166666666667 | 7.887 |
| 0.7111111111111111 | 3.525 |
| 0.7118055555555555 | 3.525 |
| 0.7125 | 3.525 |
| 0.7131944444444445 | 3.525 |
| 0.7138888888888889 | 3.525 |
| 0.7145833333333332 | 3.525 |
| 0.7152777777777778 | 3.525 |
| 0.7159722222222222 | 3.525 |
| 0.7166666666666667 | 3.525 |
| 0.717361111111111 | 3.525 |
| 0.7180555555555556 | 3.525 |
| 0.71875 | 3.525 |
| 0.7194444444444444 | 3.525 |
| 0.720138888888889 | 0 |
| 0.7208333333333333 | 0 |
| 0.7215277777777778 | 0 |
| 0.7222222222222222 | 0 |
| 0.7229166666666668 | 0 |
| 0.7236111111111111 | 0 |
| 0.7243055555555555 | 0 |
| 0.725 | 0 |
| 0.7256944444444445 | 0 |
| 0.7263888888888889 | 0 |
| 0.7270833333333333 | 0 |
| 0.7277777777777777 | 0 |
| 0.7284722222222223 | 0 |
| 0.7291666666666666 | 0 |
| 0.7298611111111111 | 0 |
| 0.7305555555555556 | 0 |
| 0.7312500000000001 | 0 |
| 0.7319444444444444 | 0 |
| 0.7326388888888888 | 0 |
| 0.7333333333333334 | 0 |
| 0.7340277777777778 | 0 |
| 0.7347222222222222 | 0 |
| 0.7354166666666666 | 0 |
| 0.7361111111111112 | 0 |
| 0.7368055555555556 | 0 |
| 0.7374999999999999 | 0 |
| 0.7381944444444444 | 0 |
| 0.7388888888888889 | 0 |
| 0.7395833333333334 | 0 |
| 0.7402777777777777 | 0 |
| 0.7409722222222223 | 0 |
| 0.7416666666666667 | 0 |
| 0.7423611111111111 | 0 |
| 0.7430555555555555 | 0 |
| 0.74375 | 0 |
| 0.7444444444444445 | 0 |
| 0.7451388888888889 | 0 |
| 0.7458333333333332 | 0 |
| 0.7465277777777778 | 0 |
| 0.7472222222222222 | 0 |
| 0.7479166666666667 | 0 |
| 0.748611111111111 | 0 |
| 0.7493055555555556 | 0 |
| 0.75 | 0 |
| 0.7506944444444444 | 0 |
| 0.751388888888889 | 0 |
| 0.7520833333333333 | 0 |
| 0.7527777777777778 | 0 |
| 0.7534722222222222 | 0 |
| 0.7541666666666668 | 0 |
| 0.7548611111111111 | 0 |
| 0.7555555555555555 | 0 |
| 0.75625 | 0 |
| 0.7569444444444445 | 0 |
| 0.7576388888888889 | 0 |
| 0.7583333333333333 | 0 |
| 0.7590277777777777 | 0 |
| 0.7597222222222223 | 0 |
| 0.7604166666666666 | 0 |
| 0.7611111111111111 | 0 |
| 0.7618055555555556 | 0 |
| 0.7625000000000001 | 0 |
| 0.7631944444444444 | 0 |
| 0.7638888888888888 | 0 |
| 0.7645833333333334 | 0 |
| 0.7652777777777778 | 0 |
| 0.7659722222222222 | 0 |
| 0.7666666666666666 | 0 |
| 0.7673611111111112 | 0 |
| 0.7680555555555556 | 0 |
| 0.7687499999999999 | 0 |
| 0.7694444444444444 | 0 |
| 0.7701388888888889 | 0 |
| 0.7708333333333334 | 0 |
| 0.7715277777777777 | 0 |
| 0.7722222222222223 | 0 |
| 0.7729166666666667 | 0 |
| 0.7736111111111111 | 0 |
| 0.7743055555555555 | 0 |
| 0.775 | 0 |
| 0.7756944444444445 | 0 |
| 0.7763888888888889 | 0 |
| 0.7770833333333332 | 0 |
| 0.7777777777777778 | 0 |
| 0.7784722222222222 | 0 |
| 0.7791666666666667 | 0 |
| 0.779861111111111 | 0 |
| 0.7805555555555556 | 0 |
| 0.78125 | 0 |
| 0.7819444444444444 | 0 |
| 0.782638888888889 | 0 |
| 0.7833333333333333 | 0 |
| 0.7840277777777778 | 0 |
| 0.7847222222222222 | 0 |
| 0.7854166666666668 | 0 |
| 0.7861111111111111 | 0 |
| 0.7868055555555555 | 0 |
| 0.7875 | 0 |
| 0.7881944444444445 | 0 |
| 0.7888888888888889 | 0 |
| 0.7895833333333333 | 0 |
| 0.7902777777777777 | 0 |
| 0.7909722222222223 | 0 |
| 0.7916666666666666 | 0 |
| 0.7923611111111111 | 0 |
| 0.7930555555555556 | 0 |
| 0.7937500000000001 | 0 |
| 0.7944444444444444 | 0 |
| 0.7951388888888888 | 0 |
| 0.7958333333333334 | 0 |
| 0.7965277777777778 | 0 |
| 0.7972222222222222 | 0 |
| 0.7979166666666666 | 0 |
| 0.7986111111111112 | 0 |
| 0.7993055555555556 | 0 |
| 0.7999999999999999 | 0 |
| 0.8006944444444444 | 0 |
| 0.8013888888888889 | 0 |
| 0.8020833333333334 | 0 |
| 0.8027777777777777 | 0 |
| 0.8034722222222223 | 0 |
| 0.8041666666666667 | 0 |
| 0.8048611111111111 | 0 |
| 0.8055555555555555 | 0 |
| 0.80625 | 0 |
| 0.8069444444444445 | 0 |
| 0.8076388888888889 | 0 |
| 0.8083333333333332 | 0 |
| 0.8090277777777778 | 0 |
| 0.8097222222222222 | 0 |
| 0.8104166666666667 | 0 |
| 0.811111111111111 | 0 |
| 0.8118055555555556 | 0 |
| 0.8125 | 0 |
| 0.8131944444444444 | 0 |
| 0.813888888888889 | 0 |
| 0.8145833333333333 | 0 |
| 0.8152777777777778 | 0 |
| 0.8159722222222222 | 0 |
| 0.8166666666666668 | 0 |
| 0.8173611111111111 | 0 |
| 0.8180555555555555 | 0 |
| 0.81875 | 0 |
| 0.8194444444444445 | 0 |
| 0.8201388888888889 | 0 |
| 0.8208333333333333 | 0 |
| 0.8215277777777777 | 0 |
| 0.8222222222222223 | 0 |
| 0.8229166666666666 | 0 |
| 0.8236111111111111 | 0 |
| 0.8243055555555556 | 0 |
| 0.8250000000000001 | 0 |
| 0.8256944444444444 | 0 |
| 0.8263888888888888 | 0 |
| 0.8270833333333334 | 0 |
| 0.8277777777777778 | 0 |
| 0.8284722222222222 | 0 |
| 0.8291666666666666 | 0 |
| 0.8298611111111112 | 0 |
| 0.8305555555555556 | 0 |
| 0.8312499999999999 | 0 |
| 0.8319444444444444 | 0 |
| 0.8326388888888889 | 0 |
| 0.8333333333333334 | 0 |
| 0.8340277777777777 | 0 |
| 0.8347222222222223 | 0 |
| 0.8354166666666667 | 0 |
| 0.8361111111111111 | 0 |
| 0.8368055555555555 | 0 |
| 0.8375 | 0 |
| 0.8381944444444445 | 0 |
| 0.8388888888888889 | 0 |
| 0.8395833333333332 | 0 |
| 0.8402777777777778 | 0 |
| 0.8409722222222222 | 0 |
| 0.8416666666666667 | 0 |
| 0.842361111111111 | 0 |
| 0.8430555555555556 | 0 |
| 0.84375 | 0 |
| 0.8444444444444444 | 0 |
| 0.845138888888889 | 0 |
| 0.8458333333333333 | 0 |
| 0.8465277777777778 | 0 |
| 0.8472222222222222 | 0 |
| 0.8479166666666668 | 0 |
| 0.8486111111111111 | 0 |
| 0.8493055555555555 | 0 |
| 0.85 | 0 |
| 0.8506944444444445 | 0 |
| 0.8513888888888889 | 0 |
| 0.8520833333333333 | 0 |
| 0.8527777777777777 | 0 |
| 0.8534722222222223 | 0 |
| 0.8541666666666666 | 0 |
| 0.8548611111111111 | 0 |
| 0.8555555555555556 | 0 |
| 0.8562500000000001 | 0 |
| 0.8569444444444444 | 0 |
| 0.8576388888888888 | 0 |
| 0.8583333333333334 | 0 |
| 0.8590277777777778 | 0 |
| 0.8597222222222222 | 0 |
| 0.8604166666666666 | 0 |
| 0.8611111111111112 | 0 |
| 0.8618055555555556 | 0 |
| 0.8624999999999999 | 0 |
| 0.8631944444444444 | 0 |
| 0.8638888888888889 | 0 |
| 0.8645833333333334 | 0 |
| 0.8652777777777777 | 0 |
| 0.8659722222222223 | 0 |
| 0.8666666666666667 | 0 |
| 0.8673611111111111 | 0 |
| 0.8680555555555555 | 0 |
| 0.86875 | 0 |
| 0.8694444444444445 | 0 |
| 0.8701388888888889 | 0 |
| 0.8708333333333332 | 0 |
| 0.8715277777777778 | 0 |
| 0.8722222222222222 | 0 |
| 0.8729166666666667 | 0 |
| 0.873611111111111 | 0 |
| 0.8743055555555556 | 0 |
| 0.875 | 0 |
| 0.8756944444444444 | 0 |
| 0.876388888888889 | 0 |
| 0.8770833333333333 | 0 |
| 0.8777777777777778 | 0 |
| 0.8784722222222222 | 0 |
| 0.8791666666666668 | 0 |
| 0.8798611111111111 | 0 |
| 0.8805555555555555 | 0 |
| 0.88125 | 0 |
| 0.8819444444444445 | 0 |
| 0.8826388888888889 | 0 |
| 0.8833333333333333 | 0 |
| 0.8840277777777777 | 0 |
| 0.8847222222222223 | 0 |
| 0.8854166666666666 | 0 |
| 0.8861111111111111 | 0 |
| 0.8868055555555556 | 0 |
| 0.8875000000000001 | 0 |
| 0.8881944444444444 | 0 |
| 0.8888888888888888 | 0 |
| 0.8895833333333334 | 0 |
| 0.8902777777777778 | 0 |
| 0.8909722222222222 | 0 |
| 0.8916666666666666 | 0 |
| 0.8923611111111112 | 0 |
| 0.8930555555555556 | 0 |
| 0.8937499999999999 | 0 |
| 0.8944444444444444 | 0 |
| 0.8951388888888889 | 0 |
| 0.8958333333333334 | 0 |
| 0.8965277777777777 | 0 |
| 0.8972222222222223 | 0 |
| 0.8979166666666667 | 0 |
| 0.8986111111111111 | 0 |
| 0.8993055555555555 | 0 |
| 0.9 | 0 |
| 0.9006944444444445 | 0 |
| 0.9013888888888889 | 0 |
| 0.9020833333333332 | 0 |
| 0.9027777777777778 | 0 |
| 0.9034722222222222 | 0 |
| 0.9041666666666667 | 0 |
| 0.904861111111111 | 0 |
| 0.9055555555555556 | 0 |
| 0.90625 | 0 |
| 0.9069444444444444 | 0 |
| 0.907638888888889 | 0 |
| 0.9083333333333333 | 0 |
| 0.9090277777777778 | 0 |
| 0.9097222222222222 | 0 |
| 0.9104166666666668 | 0 |
| 0.9111111111111111 | 0 |
| 0.9118055555555555 | 0 |
| 0.9125 | 0 |
| 0.9131944444444445 | 0 |
| 0.9138888888888889 | 0 |
| 0.9145833333333333 | 0 |
| 0.9152777777777777 | 0 |
| 0.9159722222222223 | 0 |
| 0.9166666666666666 | 0 |
| 0.9173611111111111 | 0 |
| 0.9180555555555556 | 0 |
| 0.9187500000000001 | 0 |
| 0.9194444444444444 | 0 |
| 0.9201388888888888 | 0 |
| 0.9208333333333334 | 0 |
| 0.9215277777777778 | 0 |
| 0.9222222222222222 | 0 |
| 0.9229166666666666 | 0 |
| 0.9236111111111112 | 0 |
| 0.9243055555555556 | 0 |
| 0.9249999999999999 | 0 |
| 0.9256944444444444 | 0 |
| 0.9263888888888889 | 0 |
| 0.9270833333333334 | 0 |
| 0.9277777777777777 | 0 |
| 0.9284722222222223 | 0 |
| 0.9291666666666667 | 0 |
| 0.9298611111111111 | 0 |
| 0.9305555555555555 | 0 |
| 0.93125 | 0 |
| 0.9319444444444445 | 0 |
| 0.9326388888888889 | 0 |
| 0.9333333333333332 | 0 |
| 0.9340277777777778 | 0 |
| 0.9347222222222222 | 0 |
| 0.9354166666666667 | 0 |
| 0.936111111111111 | 0 |
| 0.9368055555555556 | 0 |
| 0.9375 | 0 |
| 0.9381944444444444 | 0 |
| 0.938888888888889 | 0 |
| 0.9395833333333333 | 0 |
| 0.9402777777777778 | 0 |
| 0.9409722222222222 | 0 |
| 0.9416666666666668 | 0 |
| 0.9423611111111111 | 0 |
| 0.9430555555555555 | 0 |
| 0.94375 | 0 |
| 0.9444444444444445 | 0 |
| 0.9451388888888889 | 0 |
| 0.9458333333333333 | 0 |
| 0.9465277777777777 | 0 |
| 0.9472222222222223 | 0 |
| 0.9479166666666666 | 0 |
| 0.9486111111111111 | 0 |
| 0.9493055555555556 | 0 |
| 0.9500000000000001 | 0 |
| 0.9506944444444444 | 0 |
| 0.9513888888888888 | 0 |
| 0.9520833333333334 | 0 |
| 0.9527777777777778 | 0 |
| 0.9534722222222222 | 0 |
| 0.9541666666666666 | 0 |
| 0.9548611111111112 | 0 |
| 0.9555555555555556 | 0 |
| 0.9562499999999999 | 0 |
| 0.9569444444444444 | 0 |
| 0.9576388888888889 | 0 |
| 0.9583333333333334 | 0 |
| 0.9590277777777777 | 0 |
| 0.9597222222222223 | 0 |
| 0.9604166666666667 | 0 |
| 0.9611111111111111 | 0 |
| 0.9618055555555555 | 0 |
| 0.9625 | 0 |
| 0.9631944444444445 | 0 |
| 0.9638888888888889 | 0 |
| 0.9645833333333332 | 0 |
| 0.9652777777777778 | 0 |
| 0.9659722222222222 | 0 |
| 0.9666666666666667 | 0 |
| 0.967361111111111 | 0 |
| 0.9680555555555556 | 0 |
| 0.96875 | 0 |
| 0.9694444444444444 | 0 |
| 0.970138888888889 | 0 |
| 0.9708333333333333 | 0 |
| 0.9715277777777778 | 0 |
| 0.9722222222222222 | 0 |
| 0.9729166666666668 | 0 |
| 0.9736111111111111 | 0 |
| 0.9743055555555555 | 0 |
| 0.975 | 0 |
| 0.9756944444444445 | 0 |
| 0.9763888888888889 | 0 |
| 0.9770833333333333 | 0 |
| 0.9777777777777777 | 0 |
| 0.9784722222222223 | 0 |
| 0.9791666666666666 | 0 |
| 0.9798611111111111 | 0 |
| 0.9805555555555556 | 0 |
| 0.9812500000000001 | 0 |
| 0.9819444444444444 | 0 |
| 0.9826388888888888 | 0 |
| 0.9833333333333334 | 0 |
| 0.9840277777777778 | 0 |
| 0.9847222222222222 | 0 |
| 0.9854166666666666 | 0 |
| 0.9861111111111112 | 0 |
| 0.9868055555555556 | 0 |
| 0.9874999999999999 | 0 |
| 0.9881944444444444 | 0 |
| 0.9888888888888889 | 0 |
| 0.9895833333333334 | 0 |
| 0.9902777777777777 | 0 |
| 0.9909722222222223 | 0 |
| 0.9916666666666667 | 0 |
| 0.9923611111111111 | 0 |
| 0.9930555555555555 | 0 |
| 0.99375 | 0 |
| 0.9944444444444445 | 0 |
| 0.9951388888888889 | 0 |
| 0.9958333333333332 | 0 |
| 0.9965277777777778 | 0 |
| 0.9972222222222222 | 0 |
| 0.9979166666666667 | 0 |
| 0.998611111111111 | 0 |
| 0.9993055555555556 | 0 |